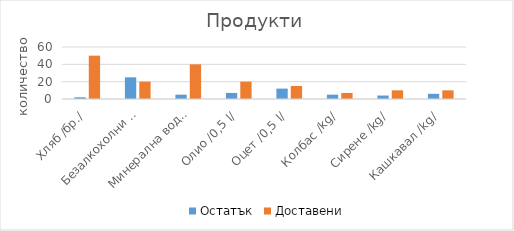
| Category | Остатък | Доставени |
|---|---|---|
| Хляб /бр./ | 2 | 50 |
| Безалкохолни напитки /2 l/ | 25 | 20 |
| Минерална вода /0,5 l/ | 5 | 40 |
| Олио /0,5 l/ | 7 | 20 |
| Оцет /0,5 l/ | 12 | 15 |
| Колбас /kg/ | 5 | 7 |
| Сирене /kg/ | 4 | 10 |
| Кашкавал /kg/ | 6 | 10 |